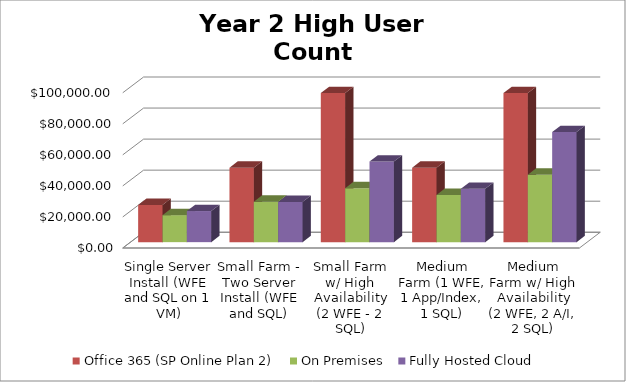
| Category | Office 365 (SP Online Plan 2)  | On Premises  | Fully Hosted Cloud    |
|---|---|---|---|
| Single Server Install (WFE and SQL on 1 VM) | 24000 | 17390.604 | 20040 |
| Small Farm - Two Server Install (WFE and SQL) | 48000 | 26085.906 | 25920 |
| Small Farm w/ High Availability (2 WFE - 2 SQL) | 96000 | 34781.208 | 51900 |
| Medium Farm (1 WFE, 1 App/Index, 1 SQL) | 48000 | 30433.557 | 34320 |
| Medium Farm w/ High Availability (2 WFE, 2 A/I, 2 SQL) | 96000 | 43476.51 | 70980 |